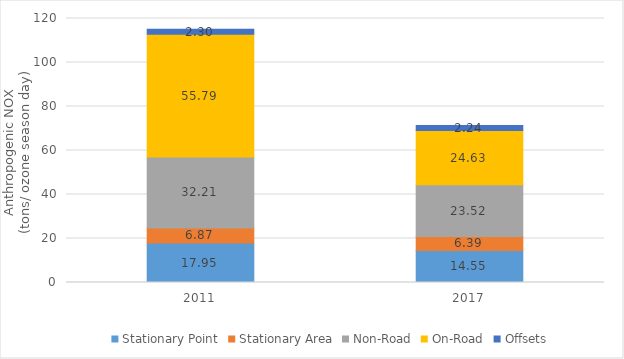
| Category | Stationary Point | Stationary Area | Non-Road | On-Road | Offsets |
|---|---|---|---|---|---|
| 2011.0 | 17.95 | 6.87 | 32.211 | 55.79 | 2.3 |
| 2017.0 | 14.547 | 6.39 | 23.525 | 24.631 | 2.238 |